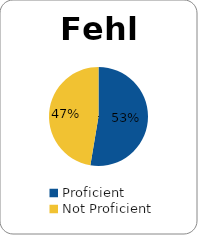
| Category | Series 0 |
|---|---|
| Proficient | 0.526 |
| Not Proficient | 0.474 |